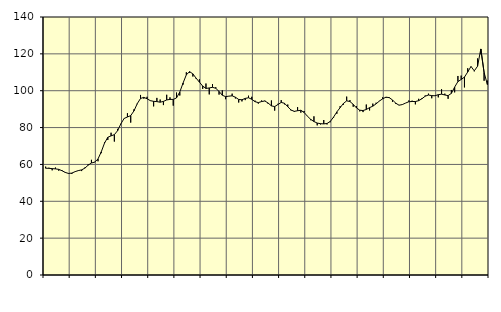
| Category | Piggar | Series 1 |
|---|---|---|
| nan | 58.8 | 57.93 |
| 87.0 | 58.2 | 57.89 |
| 87.0 | 56.8 | 57.73 |
| 87.0 | 58.3 | 57.58 |
| nan | 56.6 | 57.33 |
| 88.0 | 56.9 | 56.59 |
| 88.0 | 55.9 | 55.66 |
| 88.0 | 54.9 | 55.1 |
| nan | 54.8 | 55.29 |
| 89.0 | 56.1 | 56.08 |
| 89.0 | 56.8 | 56.66 |
| 89.0 | 56.4 | 57.04 |
| nan | 58.3 | 57.99 |
| 90.0 | 60.1 | 59.6 |
| 90.0 | 62.5 | 60.78 |
| 90.0 | 61.4 | 61.25 |
| nan | 61.7 | 62.96 |
| 91.0 | 66.1 | 66.83 |
| 91.0 | 72 | 71.6 |
| 91.0 | 73.3 | 74.73 |
| nan | 77.2 | 75.5 |
| 92.0 | 72.4 | 76.16 |
| 92.0 | 79.3 | 78.32 |
| 92.0 | 81.9 | 82.06 |
| nan | 85.1 | 84.96 |
| 93.0 | 87.8 | 85.74 |
| 93.0 | 82.7 | 86.49 |
| 93.0 | 89.9 | 89.05 |
| nan | 92.7 | 92.99 |
| 94.0 | 97.7 | 95.79 |
| 94.0 | 95.7 | 96.39 |
| 94.0 | 96.7 | 95.63 |
| nan | 94.5 | 94.61 |
| 95.0 | 91.5 | 94.24 |
| 95.0 | 96.1 | 94.09 |
| 95.0 | 95.2 | 93.77 |
| nan | 92.2 | 94.2 |
| 96.0 | 97.8 | 94.99 |
| 96.0 | 96.4 | 95.29 |
| 96.0 | 91.9 | 95.28 |
| nan | 99 | 96.09 |
| 97.0 | 97.4 | 99.31 |
| 97.0 | 103.3 | 104.17 |
| 97.0 | 110 | 108.63 |
| nan | 109.7 | 110.35 |
| 98.0 | 107.7 | 109.13 |
| 98.0 | 106.4 | 106.79 |
| 98.0 | 106.2 | 104.64 |
| nan | 101 | 102.52 |
| 99.0 | 103.9 | 101.23 |
| 99.0 | 98 | 101.5 |
| 99.0 | 103.6 | 101.84 |
| nan | 101.9 | 101.31 |
| 0.0 | 97.9 | 99.6 |
| 0.0 | 100.2 | 97.54 |
| 0.0 | 95.4 | 96.78 |
| nan | 97 | 97.06 |
| 1.0 | 98.4 | 97.23 |
| 1.0 | 95.8 | 96.47 |
| 1.0 | 93.6 | 95.25 |
| nan | 94.2 | 95.08 |
| 2.0 | 94.9 | 95.82 |
| 2.0 | 97.3 | 96.18 |
| 2.0 | 96.7 | 95.35 |
| nan | 94.6 | 94.05 |
| 3.0 | 93 | 93.55 |
| 3.0 | 94.7 | 94.12 |
| 3.0 | 94.6 | 94.42 |
| nan | 92.9 | 93.32 |
| 4.0 | 94.7 | 91.77 |
| 4.0 | 89.2 | 91.4 |
| 4.0 | 92.9 | 92.51 |
| nan | 94.9 | 93.64 |
| 5.0 | 92.6 | 93.18 |
| 5.0 | 92.5 | 91.31 |
| 5.0 | 89.3 | 89.53 |
| nan | 88.5 | 88.79 |
| 6.0 | 91.1 | 89.14 |
| 6.0 | 88.1 | 89.38 |
| 6.0 | 89 | 88.2 |
| nan | 86.1 | 86.19 |
| 7.0 | 84 | 84.46 |
| 7.0 | 86.1 | 83.27 |
| 7.0 | 81.2 | 82.46 |
| nan | 81.7 | 82.11 |
| 8.0 | 84.1 | 82 |
| 8.0 | 81.7 | 82.21 |
| 8.0 | 82.9 | 83.34 |
| nan | 85.3 | 85.69 |
| 9.0 | 87.5 | 88.5 |
| 9.0 | 91.6 | 90.8 |
| 9.0 | 92.4 | 93.07 |
| nan | 96.8 | 94.49 |
| 10.0 | 94.9 | 94.14 |
| 10.0 | 91.3 | 92.6 |
| 10.0 | 91.6 | 90.67 |
| nan | 88.8 | 89.42 |
| 11.0 | 88.4 | 89.24 |
| 11.0 | 92.5 | 89.82 |
| 11.0 | 89.3 | 90.81 |
| nan | 93 | 91.62 |
| 12.0 | 93.5 | 92.88 |
| 12.0 | 94.5 | 94.38 |
| 12.0 | 96.4 | 95.6 |
| nan | 96.1 | 96.51 |
| 13.0 | 96.5 | 96.24 |
| 13.0 | 94 | 95 |
| 13.0 | 92.8 | 93.23 |
| nan | 92.2 | 92.14 |
| 14.0 | 92.4 | 92.47 |
| 14.0 | 93.3 | 93.29 |
| 14.0 | 94.7 | 94.02 |
| nan | 94.6 | 94.15 |
| 15.0 | 92.6 | 94.13 |
| 15.0 | 95.6 | 94.59 |
| 15.0 | 96 | 95.64 |
| nan | 97.4 | 97.03 |
| 16.0 | 98.4 | 97.65 |
| 16.0 | 95.9 | 97.35 |
| 16.0 | 97.3 | 97.26 |
| nan | 96.4 | 97.85 |
| 17.0 | 100.8 | 98.13 |
| 17.0 | 98.4 | 97.69 |
| 17.0 | 95.6 | 97.33 |
| nan | 100.4 | 98.56 |
| 18.0 | 99.1 | 101.98 |
| 18.0 | 108 | 104.95 |
| 18.0 | 108.2 | 106.08 |
| nan | 101.8 | 107.4 |
| 19.0 | 112.2 | 110.17 |
| 19.0 | 113.3 | 113.18 |
| 19.0 | 110.5 | 110.77 |
| nan | 117.5 | 113.27 |
| 20.0 | 119.8 | 122.66 |
| 20.0 | 105.4 | 109.9 |
| 20.0 | 105.5 | 103.36 |